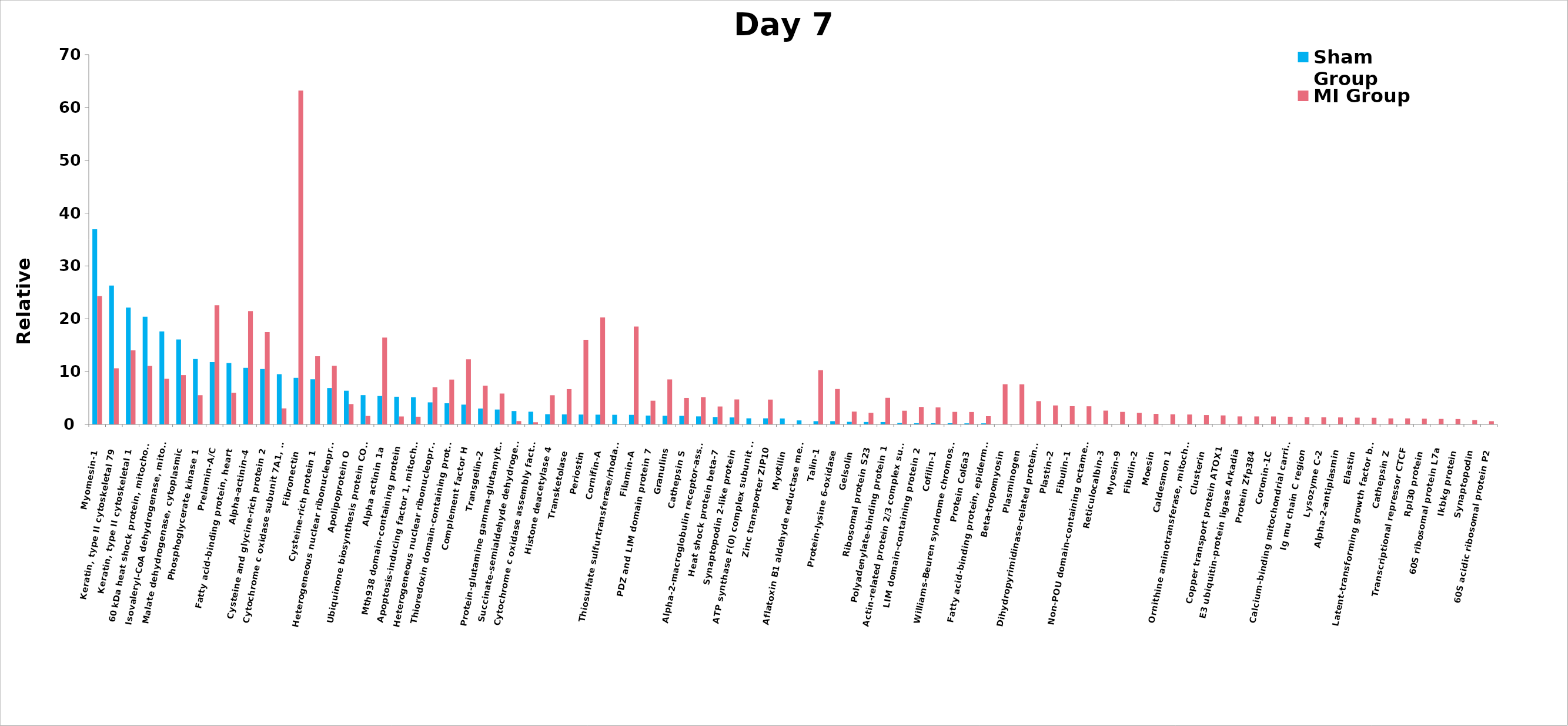
| Category | Sham Group | MI Group |
|---|---|---|
| Myomesin-1  | 36.936 | 24.29 |
| Keratin, type II cytoskeletal 79  | 26.294 | 10.63 |
| Keratin, type II cytoskeletal 1  | 22.124 | 14.036 |
| 60 kDa heat shock protein, mitochondrial  | 20.382 | 11.072 |
| Isovaleryl-CoA dehydrogenase, mitochondrial  | 17.614 | 8.64 |
| Malate dehydrogenase, cytoplasmic  | 16.068 | 9.336 |
| Phosphoglycerate kinase 1  | 12.374 | 5.536 |
| Prelamin-A/C  | 11.796 | 22.572 |
| Fatty acid-binding protein, heart  | 11.632 | 6.002 |
| Alpha-actinin-4  | 10.706 | 21.446 |
| Cysteine and glycine-rich protein 2  | 10.482 | 17.474 |
| Cytochrome c oxidase subunit 7A1, mitochondrial  | 9.504 | 3.04 |
| Fibronectin  | 8.818 | 63.224 |
| Cysteine-rich protein 1  | 8.544 | 12.9 |
| Heterogeneous nuclear ribonucleoprotein L  | 6.886 | 11.096 |
| Apolipoprotein O  | 6.38 | 3.856 |
| Ubiquinone biosynthesis protein COQ7 homolog  | 5.546 | 1.606 |
| Alpha actinin 1a  | 5.38 | 16.438 |
| Mth938 domain-containing protein  | 5.246 | 1.506 |
| Apoptosis-inducing factor 1, mitochondrial  | 5.152 | 1.462 |
| Heterogeneous nuclear ribonucleoprotein A3  | 4.178 | 7.052 |
| Thioredoxin domain-containing protein 5  | 4.006 | 8.492 |
| Complement factor H  | 3.75 | 12.312 |
| Transgelin-2  | 3.014 | 7.338 |
| Protein-glutamine gamma-glutamyltransferase 2  | 2.822 | 5.846 |
| Succinate-semialdehyde dehydrogenase, mitochondrial  | 2.536 | 0.632 |
| Cytochrome c oxidase assembly factor 7  | 2.408 | 0.412 |
| Histone deacetylase 4  | 1.938 | 5.526 |
| Transketolase  | 1.904 | 6.684 |
| Periostin  | 1.87 | 16.032 |
| Cornifin-A  | 1.848 | 20.26 |
| Thiosulfate sulfurtransferase/rhodanese-like domain-containing protein 3  | 1.824 | 0 |
| Filamin-A  | 1.814 | 18.532 |
| PDZ and LIM domain protein 7  | 1.68 | 4.49 |
| Granulins  | 1.642 | 8.52 |
| Cathepsin S  | 1.626 | 5.012 |
| Alpha-2-macroglobulin receptor-associated protein  | 1.52 | 5.166 |
| Heat shock protein beta-7  | 1.406 | 3.392 |
| Synaptopodin 2-like protein  | 1.326 | 4.73 |
| ATP synthase F(0) complex subunit B1, mitochondrial  | 1.158 | 0 |
| Zinc transporter ZIP10  | 1.156 | 4.704 |
| Myotilin  | 1.132 | 0 |
| Aflatoxin B1 aldehyde reductase member 2  | 0.762 | 0 |
| Talin-1  | 0.618 | 10.254 |
| Protein-lysine 6-oxidase  | 0.618 | 6.706 |
| Gelsolin  | 0.492 | 2.43 |
| Ribosomal protein S23  | 0.462 | 2.2 |
| Polyadenylate-binding protein 1  | 0.452 | 5.038 |
| Actin-related protein 2/3 complex subunit 3  | 0.268 | 2.594 |
| LIM domain-containing protein 2  | 0.23 | 3.31 |
| Cofilin-1  | 0.23 | 3.22 |
| Williams-Beuren syndrome chromosome region 1 homolog (Human), isoform CRA_b  | 0.23 | 2.374 |
| Protein Col6a3  | 0.206 | 2.35 |
| Fatty acid-binding protein, epidermal  | 0.206 | 1.558 |
| Beta-tropomyosin  | 0 | 7.614 |
| Plasminogen  | 0 | 7.596 |
| Dihydropyrimidinase-related protein 3  | 0 | 4.41 |
| Plastin-2  | 0 | 3.596 |
| Fibulin-1  | 0 | 3.456 |
| Non-POU domain-containing octamer-binding protein  | 0 | 3.43 |
| Reticulocalbin-3  | 0 | 2.614 |
| Myosin-9  | 0 | 2.372 |
| Fibulin-2  | 0 | 2.194 |
| Moesin  | 0 | 1.998 |
| Caldesmon 1  | 0 | 1.92 |
| Ornithine aminotransferase, mitochondrial  | 0 | 1.878 |
| Clusterin  | 0 | 1.774 |
| Copper transport protein ATOX1  | 0 | 1.708 |
| E3 ubiquitin-protein ligase Arkadia  | 0 | 1.516 |
| Protein Zfp384  | 0 | 1.512 |
| Coronin-1C  | 0 | 1.506 |
| Calcium-binding mitochondrial carrier protein Aralar2  | 0 | 1.46 |
| Ig mu chain C region  | 0 | 1.376 |
| Lysozyme C-2  | 0 | 1.356 |
| Alpha-2-antiplasmin  | 0 | 1.33 |
| Elastin  | 0 | 1.284 |
| Latent-transforming growth factor beta-binding protein 4  | 0 | 1.258 |
| Cathepsin Z  | 0 | 1.146 |
| Transcriptional repressor CTCF  | 0 | 1.146 |
| Rpl30 protein  | 0 | 1.09 |
| 60S ribosomal protein L7a  | 0 | 1.044 |
| Ikbkg protein  | 0 | 1.02 |
| Synaptopodin  | 0 | 0.82 |
| 60S acidic ribosomal protein P2  | 0 | 0.614 |